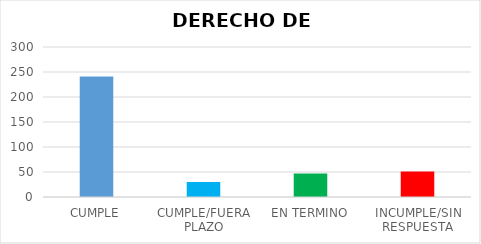
| Category | TOTAL |
|---|---|
| CUMPLE | 241 |
| CUMPLE/FUERA PLAZO | 30 |
| EN TERMINO | 47 |
| INCUMPLE/SIN RESPUESTA | 51 |